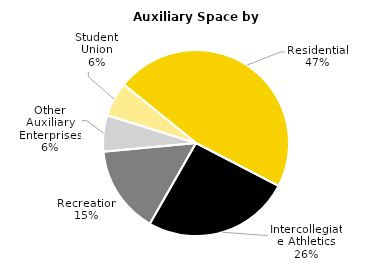
| Category | Series 0 |
|---|---|
| Residential | 1435181.54 |
| Intercollegiate Athletics | 786201.56 |
| Recreation | 468142.48 |
| Other Auxiliary Enterprises | 193281.71 |
| Student Union | 184364.29 |